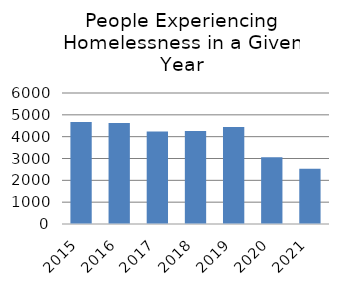
| Category | Emergency Shelter |
|---|---|
| 2015.0 | 4669 |
| 2016.0 | 4630 |
| 2017.0 | 4231 |
| 2018.0 | 4259 |
| 2019.0 | 4438 |
| 2020.0 | 3053 |
| 2021.0 | 2533 |